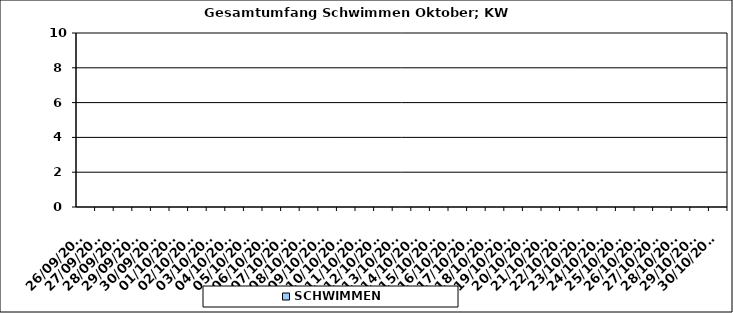
| Category | SCHWIMMEN |
|---|---|
| 26/09/2022 | 0 |
| 27/09/2022 | 0 |
| 28/09/2022 | 0 |
| 29/09/2022 | 0 |
| 30/09/2022 | 0 |
| 01/10/2022 | 0 |
| 02/10/2022 | 0 |
| 03/10/2022 | 0 |
| 04/10/2022 | 0 |
| 05/10/2022 | 0 |
| 06/10/2022 | 0 |
| 07/10/2022 | 0 |
| 08/10/2022 | 0 |
| 09/10/2022 | 0 |
| 10/10/2022 | 0 |
| 11/10/2022 | 0 |
| 12/10/2022 | 0 |
| 13/10/2022 | 0 |
| 14/10/2022 | 0 |
| 15/10/2022 | 0 |
| 16/10/2022 | 0 |
| 17/10/2022 | 0 |
| 18/10/2022 | 0 |
| 19/10/2022 | 0 |
| 20/10/2022 | 0 |
| 21/10/2022 | 0 |
| 22/10/2022 | 0 |
| 23/10/2022 | 0 |
| 24/10/2022 | 0 |
| 25/10/2022 | 0 |
| 26/10/2022 | 0 |
| 27/10/2022 | 0 |
| 28/10/2022 | 0 |
| 29/10/2022 | 0 |
| 30/10/2022 | 0 |